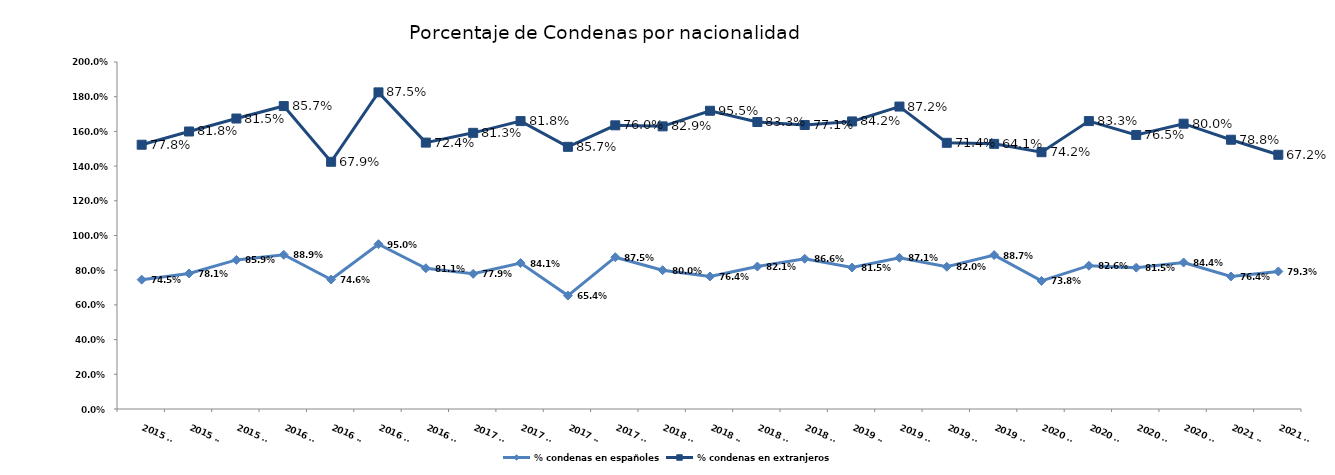
| Category | % condenas en españoles | % condenas en extranjeros |
|---|---|---|
| 2015 T2 | 0.745 | 0.778 |
| 2015 T3 | 0.781 | 0.818 |
| 2015 T4 | 0.859 | 0.815 |
| 2016 T1 | 0.889 | 0.857 |
| 2016 T2 | 0.746 | 0.679 |
| 2016 T3 | 0.95 | 0.875 |
| 2016 T4 | 0.811 | 0.724 |
| 2017 T1 | 0.779 | 0.812 |
| 2017 T2 | 0.841 | 0.818 |
| 2017 T3 | 0.654 | 0.857 |
| 2017 T4 | 0.875 | 0.76 |
| 2018 T1 | 0.8 | 0.829 |
| 2018 T2 | 0.764 | 0.955 |
| 2018 T3 | 0.821 | 0.833 |
| 2018 T4 | 0.866 | 0.771 |
| 2019 T1 | 0.815 | 0.842 |
| 2019 T2 | 0.871 | 0.872 |
| 2019 T3 | 0.82 | 0.714 |
| 2019 T4 | 0.887 | 0.641 |
| 2020 T1 | 0.738 | 0.742 |
| 2020 T2 | 0.826 | 0.833 |
| 2020 T3 | 0.815 | 0.765 |
| 2020 T4 | 0.844 | 0.8 |
| 2021 T1 | 0.764 | 0.788 |
| 2021 T2 | 0.793 | 0.672 |